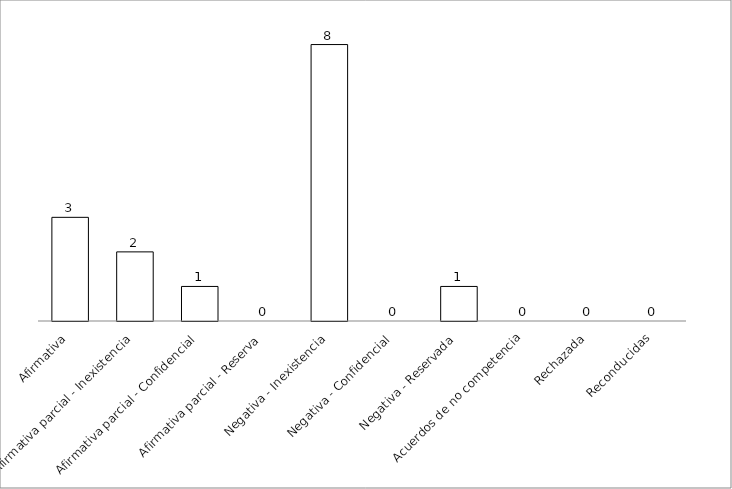
| Category | Series 0 |
|---|---|
| Afirmativa | 3 |
| Afirmativa parcial - Inexistencia | 2 |
| Afirmativa parcial - Confidencial | 1 |
| Afirmativa parcial - Reserva | 0 |
| Negativa - Inexistencia | 8 |
| Negativa - Confidencial | 0 |
| Negativa - Reservada | 1 |
| Acuerdos de no competencia | 0 |
| Rechazada | 0 |
| Reconducidas | 0 |